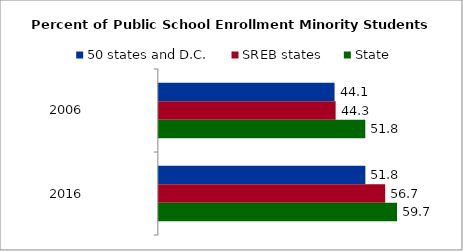
| Category | 50 states and D.C. | SREB states | State |
|---|---|---|---|
| 2006.0 | 44.055 | 44.323 | 51.761 |
| 2016.0 | 51.772 | 56.747 | 59.719 |